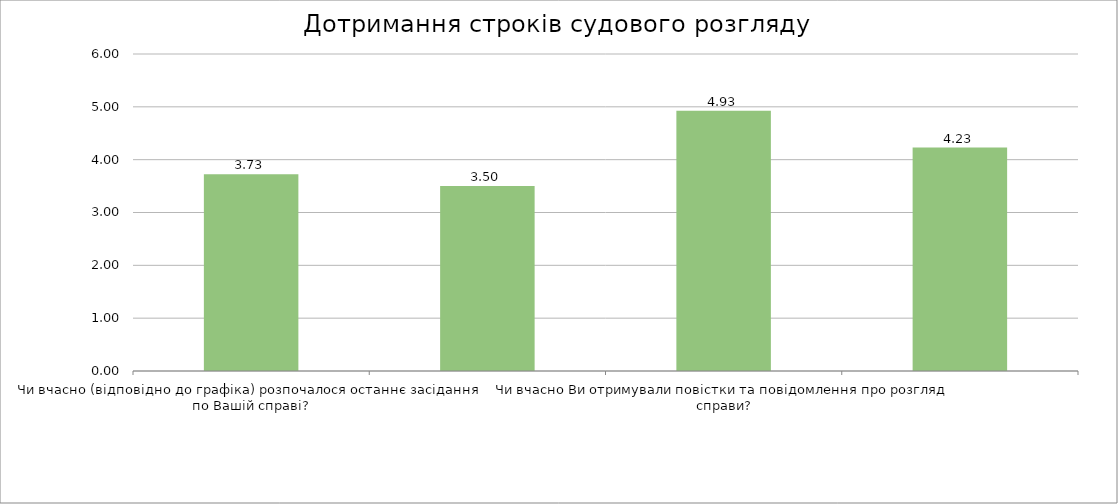
| Category | Series 0 |
|---|---|
| Чи вчасно (відповідно до графіка) розпочалося останнє засідання по Вашій справі? | 3.725 |
| Чи було враховано Ваші побажання при призначенні дня та часу засідання? | 3.5 |
| Чи вчасно Ви отримували повістки та повідомлення про розгляд справи? | 4.925 |
| Чи вважаєте Ви обґрунтованими затримки/ перенесення слухань у розгляді Вашої справи? | 4.229 |